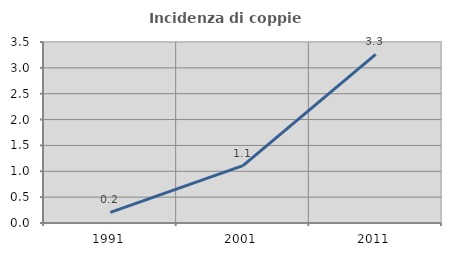
| Category | Incidenza di coppie miste |
|---|---|
| 1991.0 | 0.207 |
| 2001.0 | 1.111 |
| 2011.0 | 3.261 |